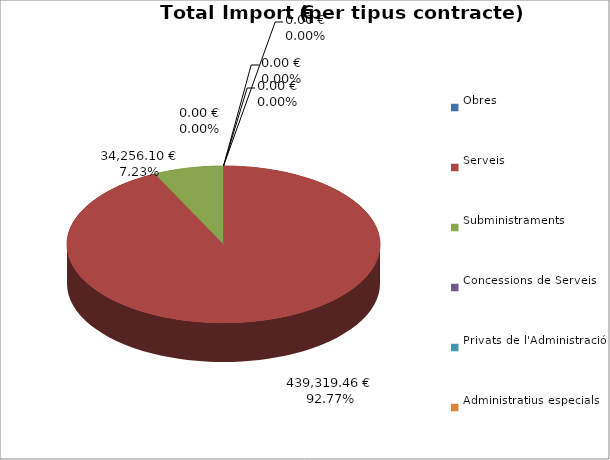
| Category | Total preu
(amb IVA) |
|---|---|
| Obres | 0 |
| Serveis | 439319.46 |
| Subministraments | 34256.1 |
| Concessions de Serveis | 0 |
| Privats de l'Administració | 0 |
| Administratius especials | 0 |